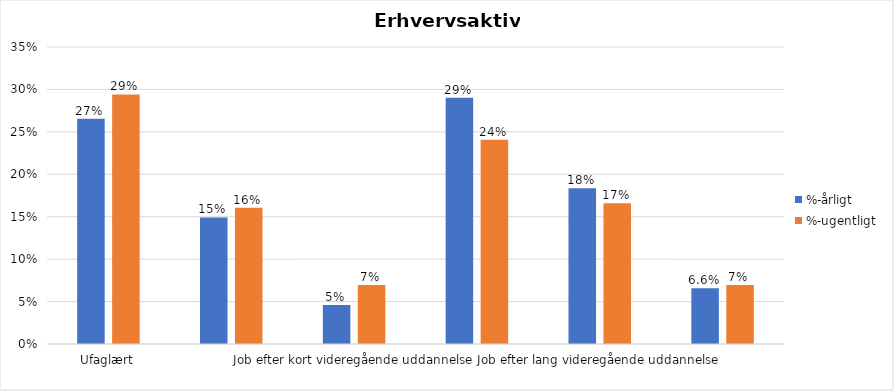
| Category | %-årligt | %-ugentligt |
|---|---|---|
| Ufaglært | 0.266 | 0.294 |
| Erhvervsfagligt job | 0.149 | 0.16 |
| Job efter kort videregående uddannelse | 0.046 | 0.07 |
| Job efter mellemlang videregående uddannelse | 0.29 | 0.241 |
| Job efter lang videregående uddannelse | 0.184 | 0.166 |
| Selvstændig | 0.066 | 0.07 |